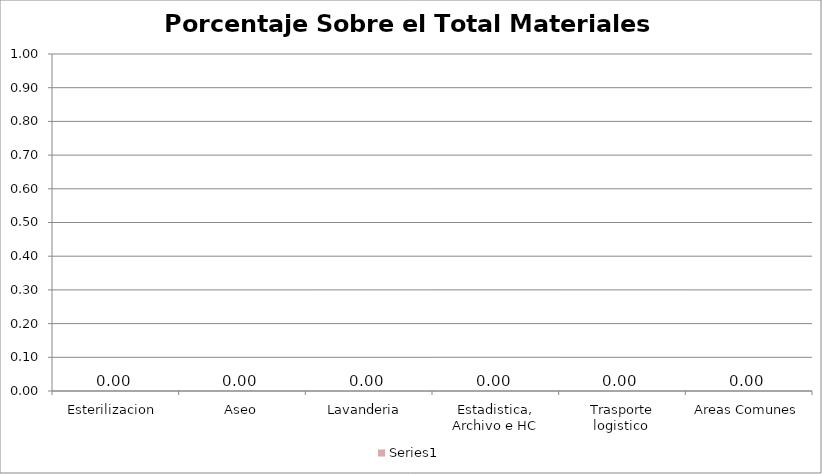
| Category | Series 13 |
|---|---|
| Esterilizacion  | 0 |
| Aseo | 0 |
| Lavanderia  | 0 |
| Estadistica, Archivo e HC | 0 |
| Trasporte logistico  | 0 |
| Areas Comunes | 0 |